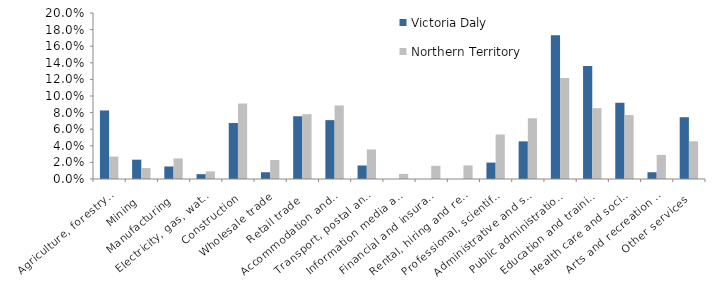
| Category | Victoria Daly | Northern Territory |
|---|---|---|
| Agriculture, forestry and fishing | 0.083 | 0.027 |
| Mining | 0.023 | 0.013 |
| Manufacturing | 0.015 | 0.025 |
| Electricity, gas, water and waste services | 0.006 | 0.009 |
| Construction | 0.067 | 0.091 |
| Wholesale trade | 0.008 | 0.023 |
| Retail trade | 0.076 | 0.078 |
| Accommodation and food services | 0.071 | 0.089 |
| Transport, postal and warehousing | 0.016 | 0.036 |
| Information media and telecommunications | 0 | 0.006 |
| Financial and insurance services | 0 | 0.016 |
| Rental, hiring and real estate services | 0 | 0.016 |
| Professional, scientific and technical services | 0.02 | 0.054 |
| Administrative and support services | 0.045 | 0.073 |
| Public administration and safety | 0.173 | 0.122 |
| Education and training | 0.136 | 0.085 |
| Health care and social assistance | 0.092 | 0.077 |
| Arts and recreation services | 0.008 | 0.029 |
| Other services | 0.074 | 0.045 |